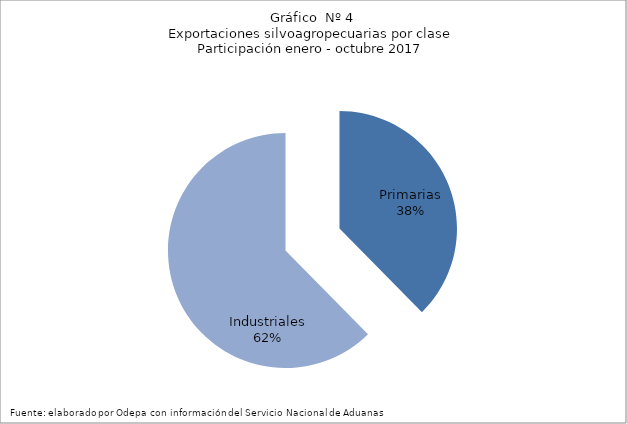
| Category | Series 0 |
|---|---|
| Primarias | 5030467 |
| Industriales | 8342734 |